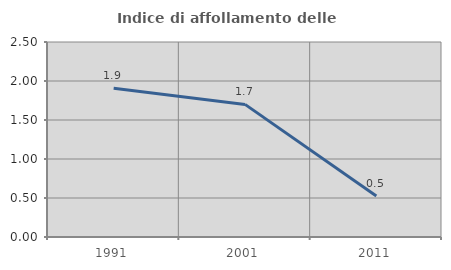
| Category | Indice di affollamento delle abitazioni  |
|---|---|
| 1991.0 | 1.906 |
| 2001.0 | 1.7 |
| 2011.0 | 0.524 |